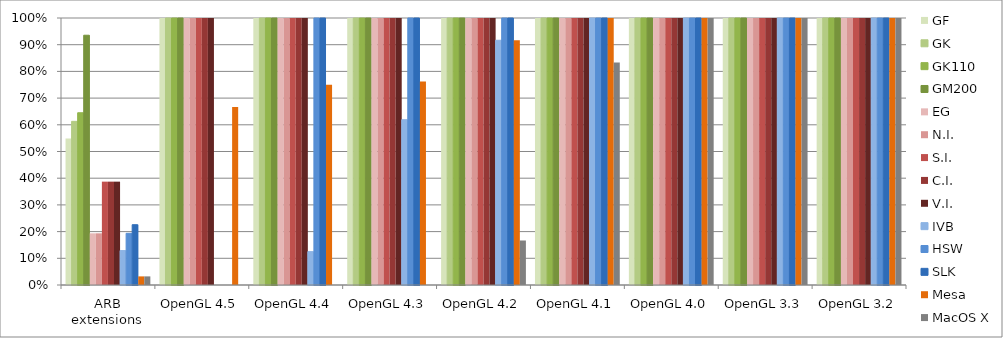
| Category | GF | GK | GK110 | GM200 | EG | N.I. | S.I. | C.I. | V.I. | IVB | HSW | SLK | Mesa | MacOS X |
|---|---|---|---|---|---|---|---|---|---|---|---|---|---|---|
| ARB extensions | 0.548 | 0.613 | 0.645 | 0.935 | 0.194 | 0.194 | 0.387 | 0.387 | 0.387 | 0.129 | 0.194 | 0.226 | 0.032 | 0.032 |
| OpenGL 4.5 | 1 | 1 | 1 | 1 | 1 | 1 | 1 | 1 | 1 | 0 | 0 | 0 | 0.667 | 0 |
| OpenGL 4.4 | 1 | 1 | 1 | 1 | 1 | 1 | 1 | 1 | 1 | 0.125 | 1 | 1 | 0.75 | 0 |
| OpenGL 4.3 | 1 | 1 | 1 | 1 | 1 | 1 | 1 | 1 | 1 | 0.619 | 1 | 1 | 0.762 | 0 |
| OpenGL 4.2 | 1 | 1 | 1 | 1 | 1 | 1 | 1 | 1 | 1 | 0.917 | 1 | 1 | 0.917 | 0.167 |
| OpenGL 4.1 | 1 | 1 | 1 | 1 | 1 | 1 | 1 | 1 | 1 | 1 | 1 | 1 | 1 | 0.833 |
| OpenGL 4.0 | 1 | 1 | 1 | 1 | 1 | 1 | 1 | 1 | 1 | 1 | 1 | 1 | 1 | 1 |
| OpenGL 3.3 | 1 | 1 | 1 | 1 | 1 | 1 | 1 | 1 | 1 | 1 | 1 | 1 | 1 | 1 |
| OpenGL 3.2 | 1 | 1 | 1 | 1 | 1 | 1 | 1 | 1 | 1 | 1 | 1 | 1 | 1 | 1 |